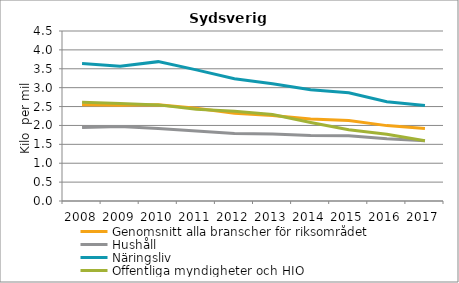
| Category | Genomsnitt alla branscher för riksområdet | Hushåll | Näringsliv | Offentliga myndigheter och HIO |
|---|---|---|---|---|
| 2008 | 2.545 | 1.946 | 3.637 | 2.612 |
| 2009 | 2.534 | 1.974 | 3.566 | 2.579 |
| 2010 | 2.548 | 1.921 | 3.689 | 2.544 |
| 2011 | 2.452 | 1.853 | 3.471 | 2.428 |
| 2012 | 2.322 | 1.787 | 3.239 | 2.374 |
| 2013 | 2.26 | 1.77 | 3.106 | 2.29 |
| 2014 | 2.17 | 1.733 | 2.947 | 2.079 |
| 2015 | 2.13 | 1.724 | 2.863 | 1.888 |
| 2016 | 1.996 | 1.646 | 2.629 | 1.766 |
| 2017 | 1.921 | 1.592 | 2.528 | 1.594 |